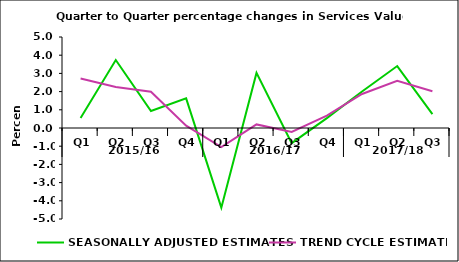
| Category | SEASONALLY ADJUSTED ESTIMATES | TREND CYCLE ESTIMATES |
|---|---|---|
| 0 | 0.555 | 2.716 |
| 1 | 3.736 | 2.258 |
| 2 | 0.936 | 1.991 |
| 3 | 1.627 | 0.126 |
| 4 | -4.375 | -1.044 |
| 5 | 3.029 | 0.196 |
| 6 | -0.834 | -0.22 |
| 7 | 0.543 | 0.681 |
| 8 | 2.008 | 1.868 |
| 9 | 3.404 | 2.589 |
| 10 | 0.763 | 2.022 |